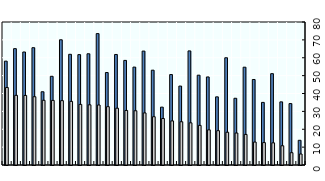
| Category | Large businesses | SMEs |
|---|---|---|
| NOR | 58.101 | 43.34 |
| BEL | 65.096 | 38.978 |
| PRT | 63.223 | 38.908 |
| FIN | 65.625 | 38.199 |
| AUS | 40.972 | 36.205 |
| TUR | 49.632 | 36.144 |
| AUT | 70.05 | 36.014 |
| GRC | 61.927 | 35.595 |
| IRL | 61.754 | 33.905 |
| ISL | 62.222 | 33.668 |
| CHE | 73.507 | 33.56 |
| LUX | 51.724 | 32.633 |
| DEU | 61.831 | 31.776 |
| FRA | 58.521 | 30.518 |
| BRA | 54.766 | 30.347 |
| ITA | 63.728 | 29.139 |
| DNK | 53.043 | 27.016 |
| GBR | 32.37 | 26.012 |
| SWE | 50.59 | 24.672 |
| NLD | 44.16 | 24.19 |
| LTU | 63.821 | 23.586 |
| CZE | 50.252 | 22.164 |
| KOR | 49.258 | 19.665 |
| NZL | 38.122 | 19.197 |
| SVN | 60 | 18.337 |
| JPN | 37.326 | 17.892 |
| EST | 54.717 | 17.101 |
| ESP | 47.84 | 12.823 |
| SVK | 35.024 | 12.535 |
| LVA | 51.095 | 12.398 |
| HUN | 35.322 | 10.757 |
| POL | 34.362 | 6.887 |
| CHL | 13.827 | 6.141 |